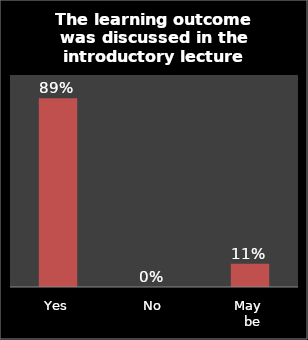
| Category | Series 0 |
|---|---|
| Yes | 0.89 |
| No | 0 |
| May 
 be | 0.11 |